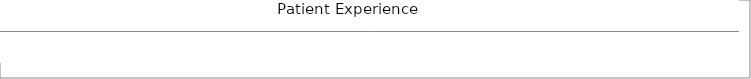
| Category | Series 0 | Series 1 |
|---|---|---|
| 0 | 0 | 0 |
| 1 | 0 | 0 |
| 2 | 0 | 0 |
| 3 | 0 | 0 |
| 4 | 0 | 0 |
| 5 | 0 | 0 |
| 6 | 0 | 0 |